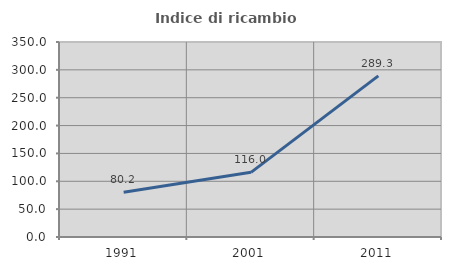
| Category | Indice di ricambio occupazionale  |
|---|---|
| 1991.0 | 80.237 |
| 2001.0 | 116.049 |
| 2011.0 | 289.286 |